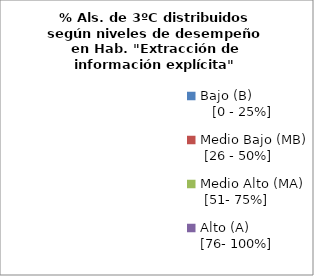
| Category | Series 0 |
|---|---|
| Bajo (B)                 [0 - 25%] | 0 |
| Medio Bajo (MB)  [26 - 50%] | 0 |
| Medio Alto (MA)   [51- 75%] | 0 |
| Alto (A)               [76- 100%] | 0 |